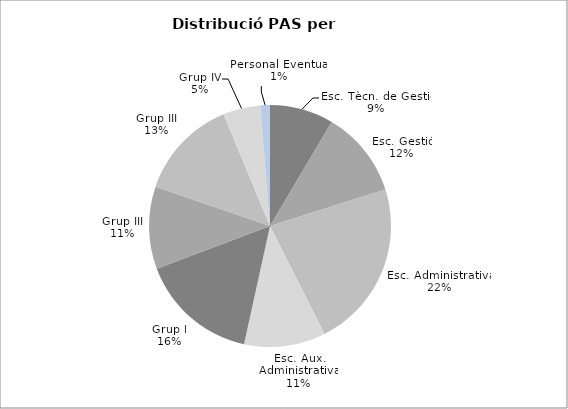
| Category | Series 0 |
|---|---|
| Esc. Tècn. de Gestió | 126 |
| Esc. Gestió | 172 |
| Esc. Administrativa | 332 |
| Esc. Aux. Administrativa | 161 |
| Grup I | 234 |
| Grup III | 163 |
| Grup III | 199 |
| Grup IV | 74 |
| Personal Eventual | 19 |